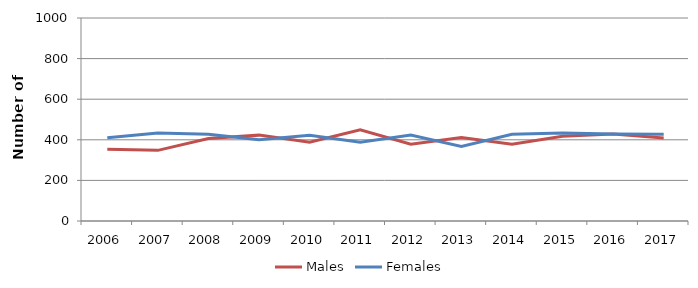
| Category | Males | Females |
|---|---|---|
| 2006.0 | 353 | 410 |
| 2007.0 | 348 | 433 |
| 2008.0 | 406 | 427 |
| 2009.0 | 423 | 400 |
| 2010.0 | 388 | 422 |
| 2011.0 | 449 | 388 |
| 2012.0 | 378 | 423 |
| 2013.0 | 411 | 367 |
| 2014.0 | 378 | 427 |
| 2015.0 | 418 | 434 |
| 2016.0 | 428 | 428 |
| 2017.0 | 409 | 427 |